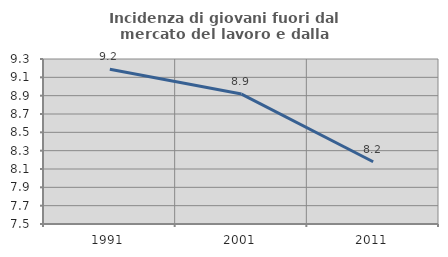
| Category | Incidenza di giovani fuori dal mercato del lavoro e dalla formazione  |
|---|---|
| 1991.0 | 9.188 |
| 2001.0 | 8.917 |
| 2011.0 | 8.179 |